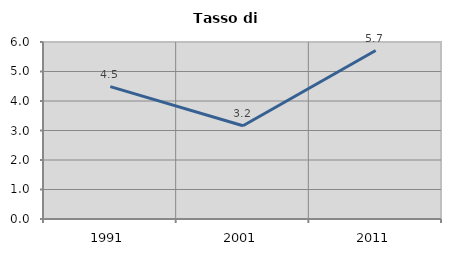
| Category | Tasso di disoccupazione   |
|---|---|
| 1991.0 | 4.488 |
| 2001.0 | 3.161 |
| 2011.0 | 5.711 |